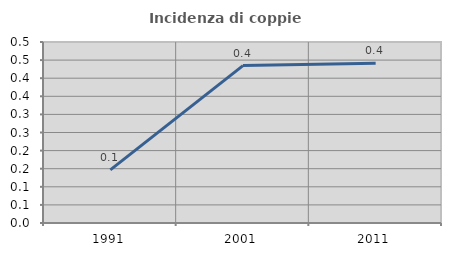
| Category | Incidenza di coppie miste |
|---|---|
| 1991.0 | 0.147 |
| 2001.0 | 0.435 |
| 2011.0 | 0.441 |